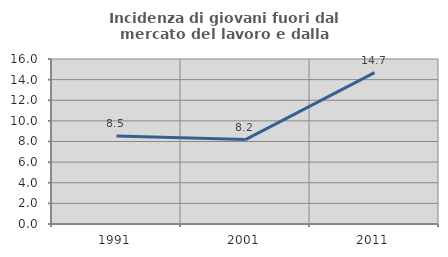
| Category | Incidenza di giovani fuori dal mercato del lavoro e dalla formazione  |
|---|---|
| 1991.0 | 8.543 |
| 2001.0 | 8.185 |
| 2011.0 | 14.672 |